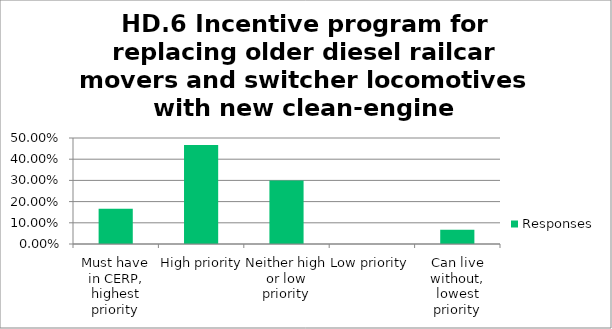
| Category | Responses |
|---|---|
| Must have in CERP, highest priority | 0.167 |
| High priority | 0.467 |
| Neither high or low priority | 0.3 |
| Low priority | 0 |
| Can live without, lowest priority | 0.067 |